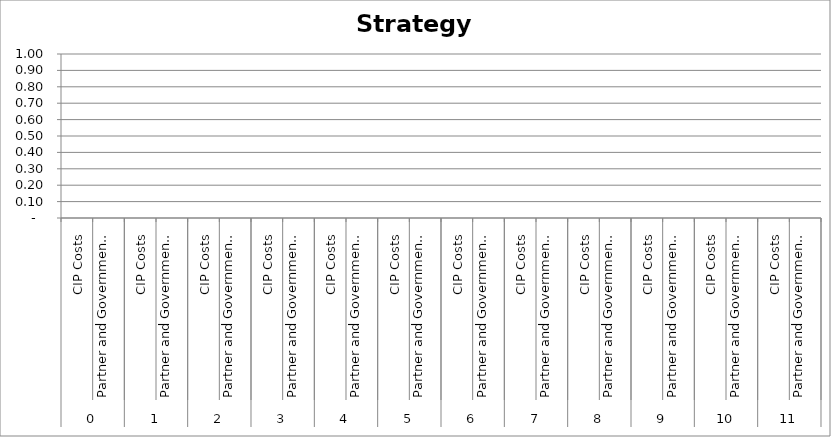
| Category | Strategy 9 |
|---|---|
| 0 | 0 |
| 1 | 0 |
| 2 | 0 |
| 3 | 0 |
| 4 | 0 |
| 5 | 0 |
| 6 | 0 |
| 7 | 0 |
| 8 | 0 |
| 9 | 0 |
| 10 | 0 |
| 11 | 0 |
| 12 | 0 |
| 13 | 0 |
| 14 | 0 |
| 15 | 0 |
| 16 | 0 |
| 17 | 0 |
| 18 | 0 |
| 19 | 0 |
| 20 | 0 |
| 21 | 0 |
| 22 | 0 |
| 23 | 0 |